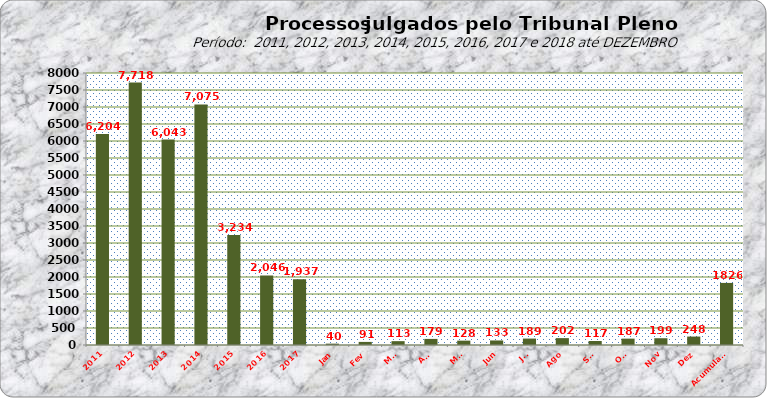
| Category | Series 0 |
|---|---|
| 2011 | 6204 |
| 2012 | 7718 |
| 2013 | 6043 |
| 2014 | 7075 |
| 2015 | 3234 |
| 2016 | 2046 |
| 2017 | 1937 |
| Jan | 40 |
| Fev | 91 |
| Mar | 113 |
| Abr | 179 |
| Mai | 128 |
| Jun | 133 |
| Jul | 189 |
| Ago | 202 |
| Set | 117 |
| Out | 187 |
| Nov | 199 |
| Dez | 248 |
| Acumulado | 1826 |